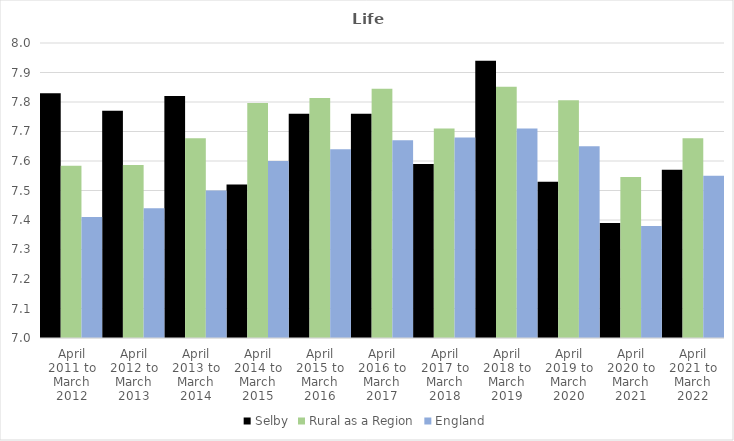
| Category | Selby | Rural as a Region | England |
|---|---|---|---|
| April 2011 to March 2012 | 7.83 | 7.584 | 7.41 |
| April 2012 to March 2013 | 7.77 | 7.586 | 7.44 |
| April 2013 to March 2014 | 7.82 | 7.677 | 7.5 |
| April 2014 to March 2015 | 7.52 | 7.797 | 7.6 |
| April 2015 to March 2016 | 7.76 | 7.813 | 7.64 |
| April 2016 to March 2017 | 7.76 | 7.845 | 7.67 |
| April 2017 to March 2018 | 7.59 | 7.71 | 7.68 |
| April 2018 to March 2019 | 7.94 | 7.852 | 7.71 |
| April 2019 to March 2020 | 7.53 | 7.806 | 7.65 |
| April 2020 to March 2021 | 7.39 | 7.546 | 7.38 |
| April 2021 to March 2022 | 7.57 | 7.677 | 7.55 |